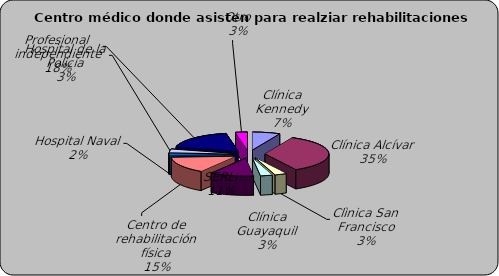
| Category | Series 0 |
|---|---|
| Clínica Kennedy | 0.07 |
| Clínica Alcívar | 0.35 |
| Clìnica San Francisco | 0.03 |
| Clínica Guayaquil | 0.03 |
| SERLI | 0.11 |
| Centro de rehabilitación física | 0.15 |
| Hospital Naval | 0.02 |
| Hospital de la Policía | 0.03 |
| Profesional independiente | 0.18 |
| Otro | 0.03 |